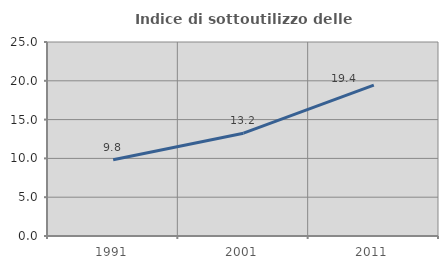
| Category | Indice di sottoutilizzo delle abitazioni  |
|---|---|
| 1991.0 | 9.827 |
| 2001.0 | 13.246 |
| 2011.0 | 19.437 |